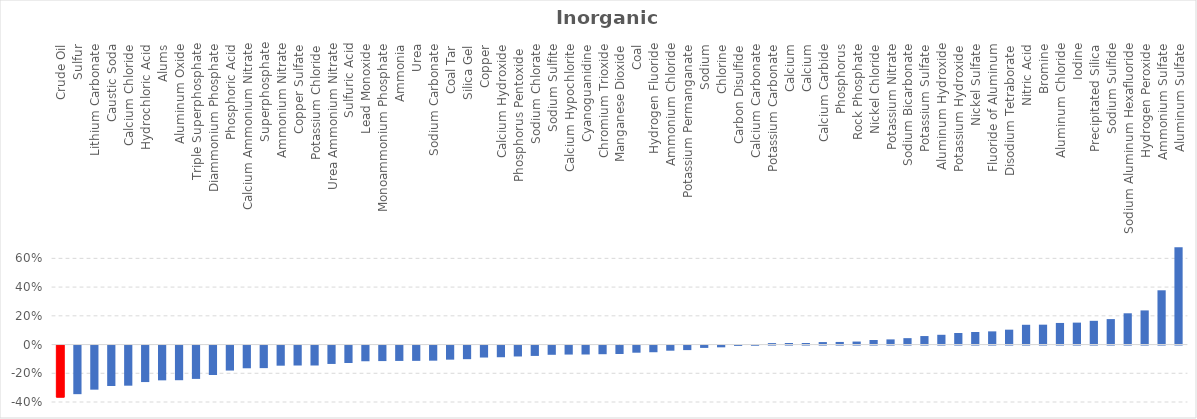
| Category | Series 0 |
|---|---|
| Crude Oil | -0.362 |
| Sulfur | -0.338 |
| Lithium Carbonate | -0.307 |
| Caustic Soda | -0.282 |
| Calcium Chloride | -0.279 |
| Hydrochloric Acid | -0.254 |
| Alums | -0.242 |
| Aluminum Oxide | -0.241 |
| Triple Superphosphate | -0.232 |
| Diammonium Phosphate | -0.205 |
| Phosphoric Acid | -0.174 |
| Calcium Ammonium Nitrate | -0.158 |
| Superphosphate | -0.157 |
| Ammonium Nitrate | -0.14 |
| Copper Sulfate | -0.139 |
| Potassium Chloride | -0.139 |
| Urea Ammonium Nitrate | -0.128 |
| Sulfuric Acid | -0.122 |
| Lead Monoxide | -0.109 |
| Monoammonium Phosphate | -0.108 |
| Ammonia | -0.107 |
| Urea | -0.107 |
| Sodium Carbonate | -0.105 |
| Coal Tar | -0.098 |
| Silica Gel | -0.095 |
| Copper | -0.083 |
| Calcium Hydroxide | -0.081 |
| Phosphorus Pentoxide  | -0.076 |
| Sodium Chlorate | -0.072 |
| Sodium Sulfite | -0.064 |
| Calcium Hypochlorite | -0.063 |
| Cyanoguanidine | -0.062 |
| Chromium Trioxide | -0.06 |
| Manganese Dioxide | -0.059 |
| Coal | -0.05 |
| Hydrogen Fluoride | -0.047 |
| Ammonium Chloride | -0.036 |
| Potassium Permanganate | -0.032 |
| Sodium | -0.016 |
| Chlorine | -0.012 |
| Carbon Disulfide | -0.002 |
| Calcium Carbonate | -0.001 |
| Potassium Carbonate | 0.01 |
| Calcium | 0.011 |
| Calcium | 0.011 |
| Calcium Carbide | 0.017 |
| Phosphorus | 0.018 |
| Rock Phosphate | 0.021 |
| Nickel Chloride | 0.032 |
| Potassium Nitrate | 0.036 |
| Sodium Bicarbonate | 0.045 |
| Potassium Sulfate | 0.059 |
| Aluminum Hydroxide | 0.068 |
| Potassium Hydroxide | 0.08 |
| Nickel Sulfate | 0.087 |
| Fluoride of Aluminum | 0.092 |
| Disodium Tetraborate | 0.104 |
| Nitric Acid | 0.138 |
| Bromine | 0.138 |
| Aluminum Chloride | 0.15 |
| Iodine | 0.153 |
| Precipitated Silica | 0.165 |
| Sodium Sulfide | 0.177 |
| Sodium Aluminum Hexafluoride | 0.218 |
| Hydrogen Peroxide | 0.238 |
| Ammonium Sulfate | 0.378 |
| Aluminum Sulfate | 0.678 |